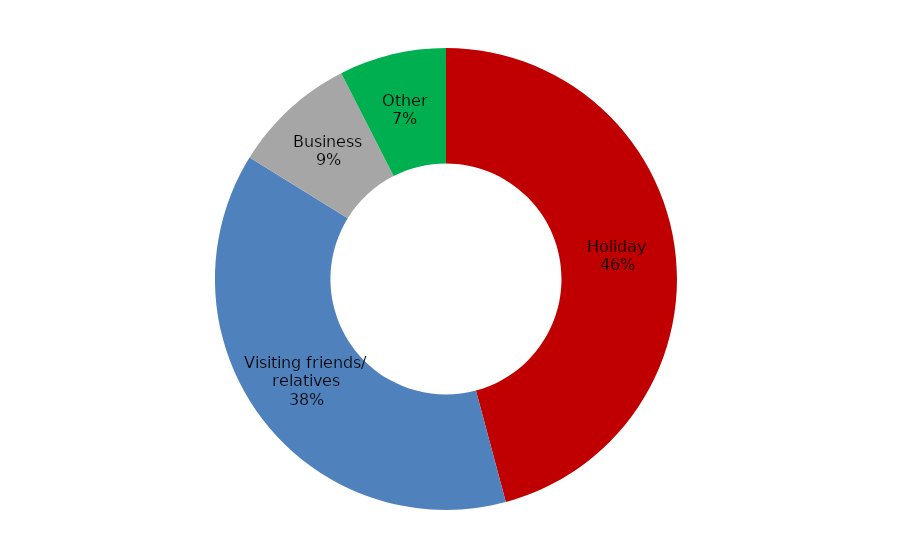
| Category | July 2013 - June 2014 |
|---|---|
| Holiday | 1910596 |
| Visiting friends/ relatives | 1583662 |
| Business | 362147.102 |
| Other | 312378.194 |